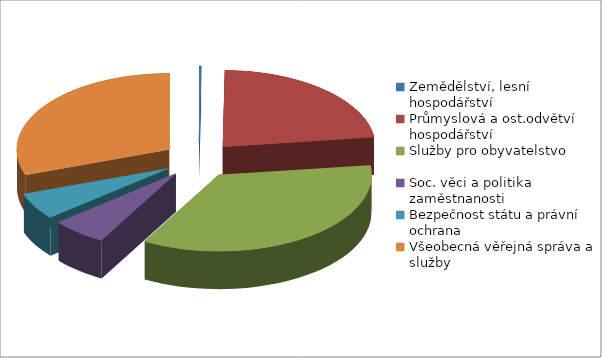
| Category | Series 0 |
|---|---|
| Zemědělství, lesní hospodářství | 17869 |
| Průmyslová a ost.odvětví hospodářství | 1880142 |
| Služby pro obyvatelstvo | 2904222 |
| Soc. věci a politika zaměstnanosti | 483312 |
| Bezpečnost státu a právní ochrana | 465088 |
| Všeobecná věřejná správa a služby | 2515866 |